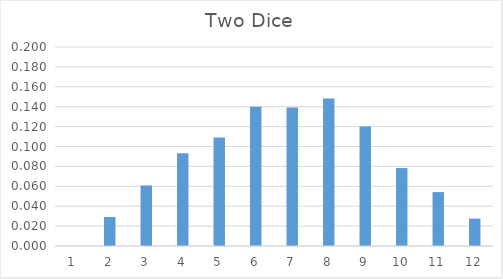
| Category | Series 0 |
|---|---|
| 0 | 0 |
| 1 | 0.029 |
| 2 | 0.061 |
| 3 | 0.093 |
| 4 | 0.109 |
| 5 | 0.14 |
| 6 | 0.139 |
| 7 | 0.148 |
| 8 | 0.12 |
| 9 | 0.078 |
| 10 | 0.054 |
| 11 | 0.028 |